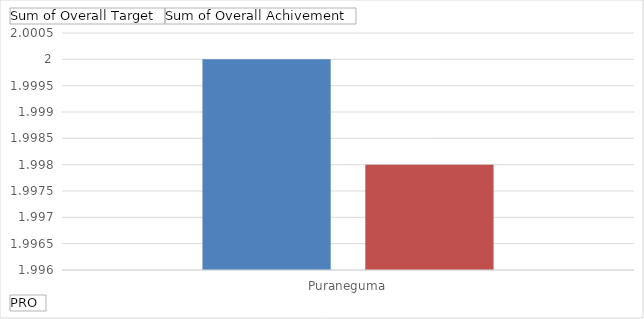
| Category | Sum of Overall Target | Sum of Overall Achivement |
|---|---|---|
| Puraneguma | 2 | 1.998 |